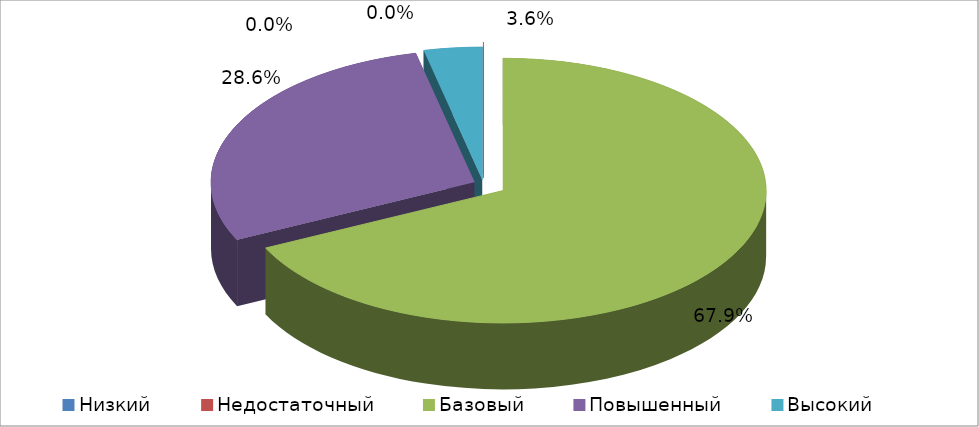
| Category | Series 0 |
|---|---|
| Низкий | 0 |
| Недостаточный | 0 |
| Базовый | 0.679 |
| Повышенный | 0.286 |
| Высокий | 0.036 |